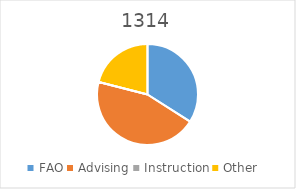
| Category | 1314 |
|---|---|
| FAO | 0.34 |
| Advising | 0.45 |
| Instruction | 0 |
| Other | 0.21 |